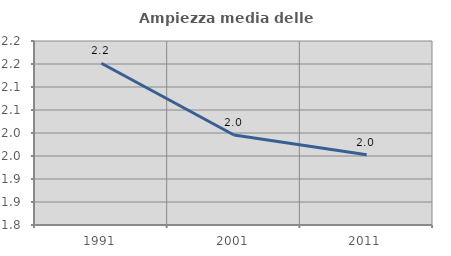
| Category | Ampiezza media delle famiglie |
|---|---|
| 1991.0 | 2.152 |
| 2001.0 | 1.996 |
| 2011.0 | 1.953 |